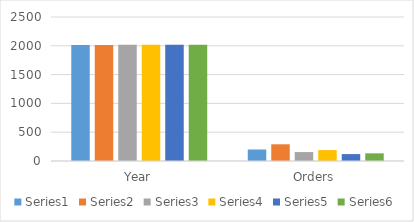
| Category | Series 0 | Series 1 | Series 2 | Series 3 | Series 4 | Series 5 |
|---|---|---|---|---|---|---|
| Year | 2015 | 2016 | 2017 | 2018 | 2019 | 2020 |
| Orders | 200 | 290 | 155 | 189 | 120 | 133 |